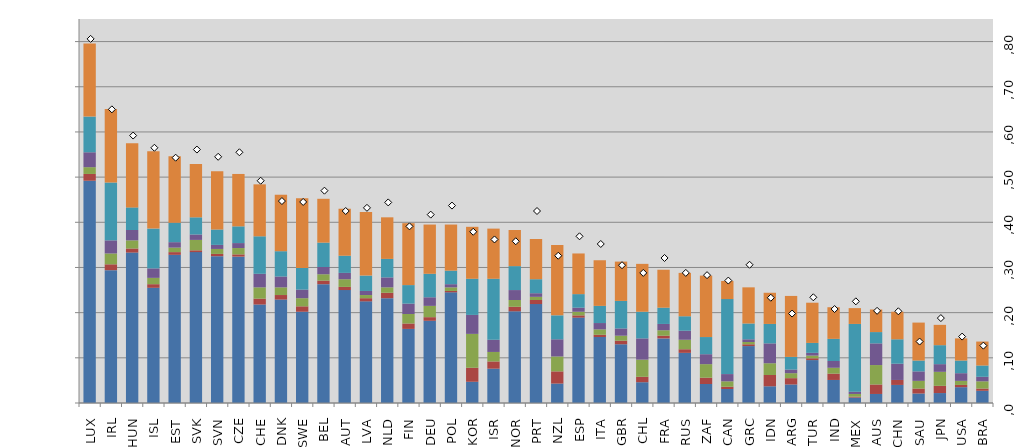
| Category | EU28 | South-east Asia | China | East Asia (excl. China) | NAFTA | Rest of the World |
|---|---|---|---|---|---|---|
| LUX | 49.2 | 1.5 | 1.5 | 3.3 | 7.9 | 16.2 |
| IRL | 29.4 | 1.3 | 2.4 | 2.9 | 12.8 | 16.3 |
| HUN | 33.3 | 0.9 | 1.8 | 2.3 | 5 | 14.2 |
| ISL | 25.5 | 0.8 | 1.4 | 2.1 | 8.8 | 17.1 |
| EST | 32.8 | 0.6 | 1 | 1.2 | 4.3 | 14.7 |
| SVK | 33.4 | 0.4 | 2.3 | 1.2 | 3.8 | 11.8 |
| SVN | 32.5 | 0.5 | 1.1 | 0.9 | 3.4 | 12.9 |
| CZE | 32.4 | 0.5 | 1.4 | 1.1 | 3.7 | 11.6 |
| CHE | 21.8 | 1.3 | 2.5 | 3 | 8.3 | 11.5 |
| DNK | 22.9 | 1 | 1.7 | 2.4 | 5.6 | 12.5 |
| SWE | 20.2 | 1.2 | 1.8 | 1.9 | 4.8 | 15.4 |
| BEL | 26.3 | 0.8 | 1.4 | 1.6 | 5.4 | 9.7 |
| AUT | 25 | 0.7 | 1.7 | 1.4 | 3.8 | 10.4 |
| LVA | 22.5 | 0.7 | 0.7 | 0.9 | 3.4 | 14.1 |
| NLD | 23.2 | 1.2 | 1.2 | 2.2 | 4.1 | 9.2 |
| FIN | 16.4 | 1.2 | 2.1 | 2.3 | 4.1 | 13.7 |
| DEU | 18.2 | 0.8 | 2.5 | 1.9 | 5.2 | 10.9 |
| POL | 24.5 | 0.3 | 0.8 | 0.7 | 3 | 10.2 |
| KOR | 4.7 | 3.1 | 7.5 | 4.2 | 8 | 11.5 |
| ISR | 7.6 | 1.6 | 2.1 | 2.7 | 13.5 | 11.1 |
| NOR | 20.3 | 1 | 1.5 | 2.2 | 5.3 | 8 |
| PRT | 21.9 | 0.9 | 0.7 | 0.8 | 3.1 | 8.9 |
| NZL | 4.3 | 2.7 | 3.3 | 3.8 | 5.3 | 15.6 |
| ESP | 18.9 | 0.5 | 0.8 | 0.9 | 3 | 9 |
| ITA | 14.6 | 0.5 | 1.2 | 1.4 | 3.8 | 10.1 |
| GBR | 13 | 0.8 | 1.1 | 1.6 | 6.1 | 8.7 |
| CHL | 4.6 | 1.2 | 3.8 | 4.7 | 5.9 | 10.6 |
| FRA | 14.3 | 0.6 | 1.2 | 1.4 | 3.6 | 8.4 |
| RUS | 11.1 | 0.8 | 2.1 | 2 | 3.2 | 9.6 |
| ZAF | 4.2 | 1.4 | 3 | 2.2 | 3.8 | 13.6 |
| CAN | 3.1 | 0.5 | 1.2 | 1.6 | 16.6 | 4 |
| GRC | 12.6 | 0.4 | 0.5 | 0.6 | 3.5 | 8 |
| IDN | 3.7 | 2.5 | 2.6 | 4.4 | 4.3 | 6.9 |
| ARG | 4.1 | 1.4 | 1.1 | 0.8 | 2.8 | 13.5 |
| TUR | 9.5 | 0.4 | 0.6 | 0.6 | 2.2 | 8.9 |
| IND | 5.1 | 1.4 | 1.3 | 1.5 | 4.9 | 7 |
| MEX | 1.2 | 0.2 | 0.6 | 0.5 | 15 | 3.5 |
| AUS | 2 | 2.1 | 4.3 | 4.8 | 2.5 | 5 |
| CHN | 4 | 1.1 | 0 | 3.6 | 5.4 | 6.1 |
| SAU | 2.1 | 1.1 | 1.7 | 2.1 | 2.4 | 8.4 |
| JPN | 2.2 | 1.6 | 3.1 | 1.7 | 4.2 | 4.5 |
| USA | 3.5 | 0.5 | 0.9 | 1.7 | 2.8 | 4.9 |
| BRA | 2.7 | 0.5 | 1.6 | 1 | 2.5 | 5.3 |